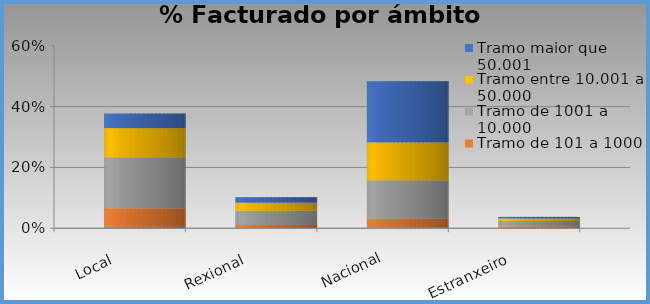
| Category | Tramo  de 0 a 100 € | Tramo de 101 a 1000 | Tramo de 1001 a 10.000 | Tramo entre 10.001 a 50.000 | Tramo maior que 50.001 |
|---|---|---|---|---|---|
| Local | 0.005 | 0.061 | 0.168 | 0.096 | 0.048 |
| Rexional | 0.001 | 0.01 | 0.047 | 0.026 | 0.018 |
| Nacional | 0.003 | 0.028 | 0.127 | 0.125 | 0.201 |
| Estranxeiro | 0 | 0.006 | 0.018 | 0.008 | 0.005 |